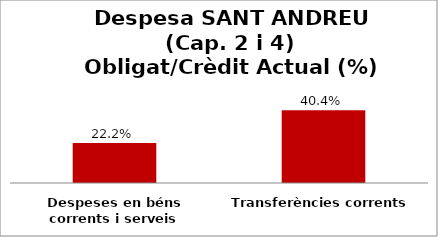
| Category | Series 0 |
|---|---|
| Despeses en béns corrents i serveis | 0.222 |
| Transferències corrents | 0.404 |